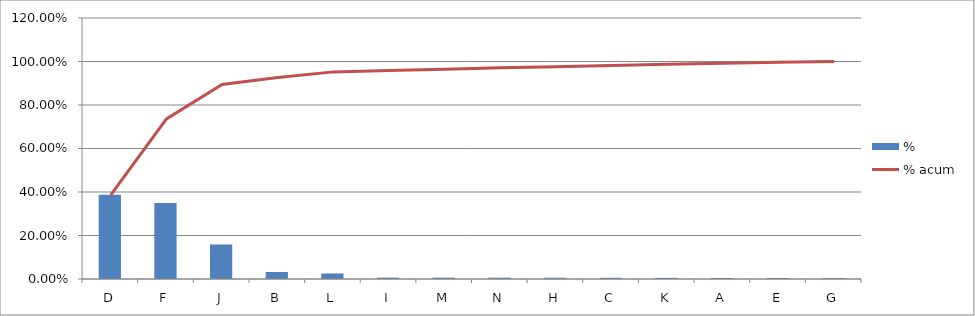
| Category | % |
|---|---|
| D | 0.387 |
| F | 0.349 |
| J | 0.159 |
| B | 0.032 |
| L | 0.025 |
| I | 0.006 |
| M | 0.006 |
| N | 0.006 |
| H | 0.006 |
| C | 0.006 |
| K | 0.005 |
| A | 0.005 |
| E | 0.004 |
| G | 0.004 |